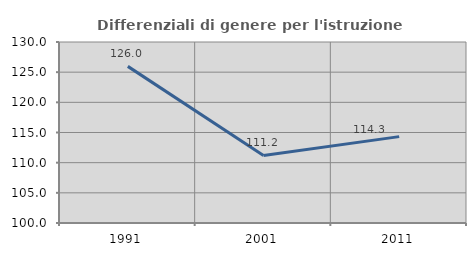
| Category | Differenziali di genere per l'istruzione superiore |
|---|---|
| 1991.0 | 125.96 |
| 2001.0 | 111.204 |
| 2011.0 | 114.318 |